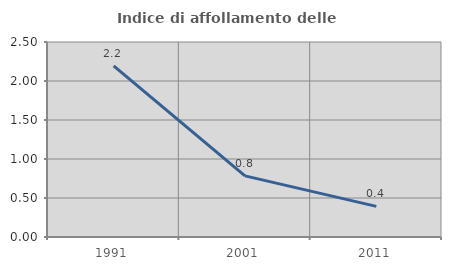
| Category | Indice di affollamento delle abitazioni  |
|---|---|
| 1991.0 | 2.195 |
| 2001.0 | 0.784 |
| 2011.0 | 0.393 |